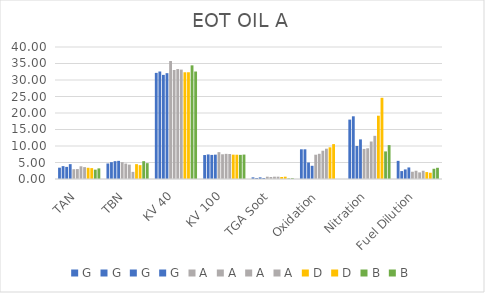
| Category | G | A | D | B |
|---|---|---|---|---|
| TAN | 4.5 | 3.6 | 3.3 | 3.22 |
| TBN | 5.5 | 2.16 | 4.2 | 4.8 |
| KV 40 | 32.07 | 33.15 | 32.35 | 32.57 |
| KV 100 | 7.38 | 7.58 | 7.36 | 7.4 |
| TGA Soot | 0.3 | 0.7 | 0.7 | 0.24 |
| Oxidation | 4 | 9.18 | 10.57 | 0 |
| Nitration | 12 | 13.08 | 24.61 | 10.27 |
| Fuel Dilution | 3.5 | 2.5 | 1.9 | 3.4 |